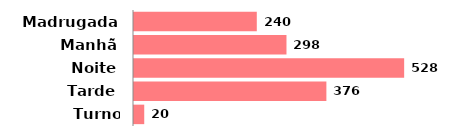
| Category | Qtde |
|---|---|
| Madrugada | 240 |
| Manhã | 298 |
| Noite | 528 |
| Tarde | 376 |
| Turno inválido | 20 |